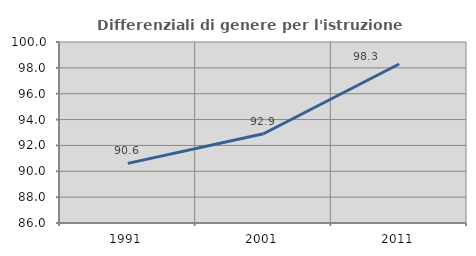
| Category | Differenziali di genere per l'istruzione superiore |
|---|---|
| 1991.0 | 90.613 |
| 2001.0 | 92.901 |
| 2011.0 | 98.299 |